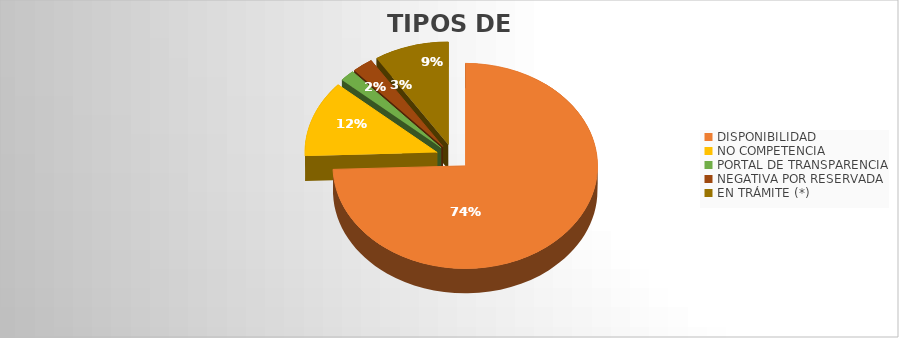
| Category | Series 0 |
|---|---|
| DISPONIBILIDAD | 204 |
| NO COMPETENCIA | 33 |
| PORTAL DE TRANSPARENCIA | 5 |
| NEGATIVA POR RESERVADA | 7 |
| EN TRÁMITE (*) | 25 |